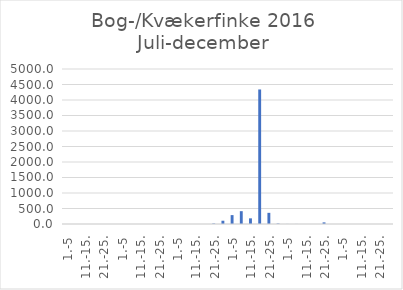
| Category | Series 0 |
|---|---|
| 1.-5 | 0 |
| 6.-10. | 0 |
| 11.-15. | 0 |
| 16.-20. | 0 |
| 21.-25. | 0 |
| 26.-31. | 0 |
| 1.-5 | 0 |
| 6.-10. | 0 |
| 11.-15. | 0 |
| 16.-20. | 0 |
| 21.-25. | 0 |
| 26.-31. | 0 |
| 1.-5 | 0 |
| 6.-10. | 0 |
| 11.-15. | 0 |
| 16.-20. | 0 |
| 21.-25. | 15.513 |
| 26.-30. | 105.693 |
| 1.-5 | 286.758 |
| 6.-10. | 413.703 |
| 11.-15. | 182.346 |
| 16.-20. | 4339.812 |
| 21.-25. | 360.06 |
| 26.-31. | 14.675 |
| 1.-5 | 1.851 |
| 6.-10. | 1.711 |
| 11.-15. | 0 |
| 16.-20. | 0 |
| 21.-25. | 52.134 |
| 26.-30. | 0 |
| 1.-5 | 0 |
| 6.-10. | 0 |
| 11.-15. | 0 |
| 16.-20. | 0 |
| 21.-25. | 0 |
| 26.-31. | 0 |